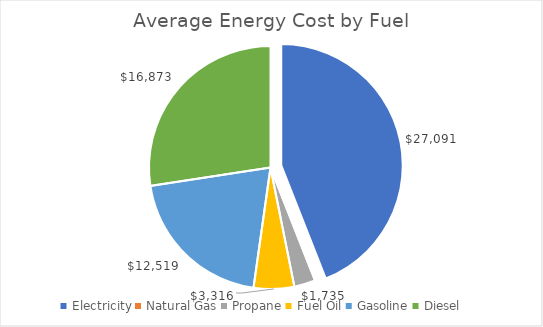
| Category | Series 4 |
|---|---|
| Electricity | 27091.367 |
| Natural Gas | 0 |
| Propane | 1735.482 |
| Fuel Oil | 3316.205 |
| Gasoline | 12518.805 |
| Diesel | 16873.372 |